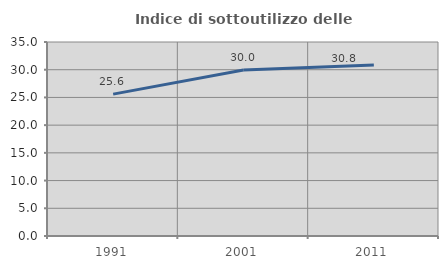
| Category | Indice di sottoutilizzo delle abitazioni  |
|---|---|
| 1991.0 | 25.594 |
| 2001.0 | 29.962 |
| 2011.0 | 30.84 |